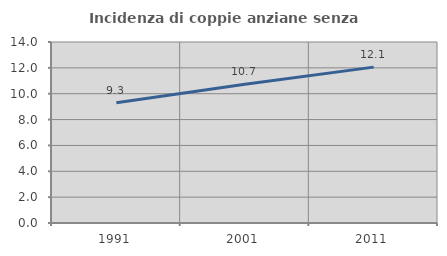
| Category | Incidenza di coppie anziane senza figli  |
|---|---|
| 1991.0 | 9.309 |
| 2001.0 | 10.739 |
| 2011.0 | 12.057 |